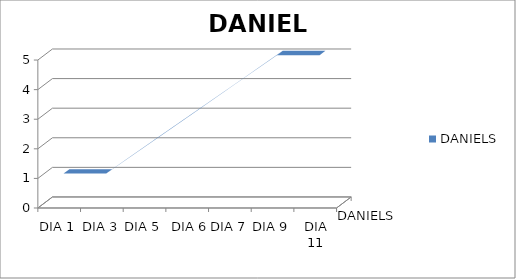
| Category | DANIELS |
|---|---|
| DIA 1 | 1 |
| DIA 3 | 1 |
| DIA 5 | 2 |
|  DIA 6 | 3 |
| DIA 7 | 4 |
| DIA 9 | 5 |
| DIA 11 | 5 |